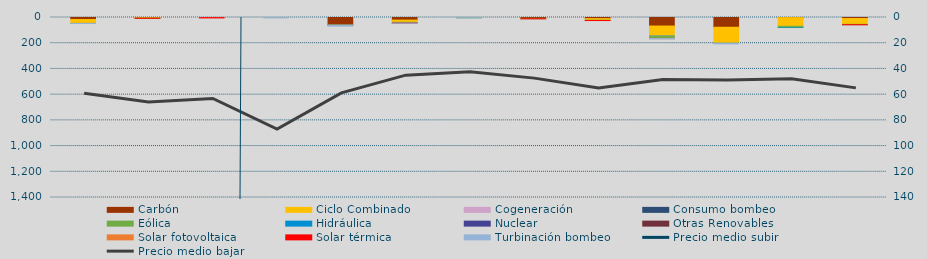
| Category | Carbón | Ciclo Combinado | Cogeneración | Consumo bombeo | Eólica | Hidráulica | Nuclear | Otras Renovables | Solar fotovoltaica | Solar térmica | Turbinación bombeo |
|---|---|---|---|---|---|---|---|---|---|---|---|
| 0 | 15307.2 | 30295.6 | 0 |  | 607.6 | 24 |  | 0 | 0 | 0 | 856 |
| 1 | 2438 | 3386 | 0 |  | 274 | 0 |  | 0 | 0 | 117.8 | 0 |
| 2 | 0 | 0 | 0 |  | 0 | 1009.1 |  | 0 | 0 | 2368.1 | 0 |
| 3 | 0 | 400 | 0 |  | 0 | 0 |  | 0 | 0 | 0 | 2763.2 |
| 4 | 58033.7 | 0 | 0 |  | 988.1 | 1026.5 |  | 0 | 57.8 | 0 | 6933.6 |
| 5 | 20255.7 | 17094 | 0 |  | 5344.3 | 623 |  | 0 | 0 | 617.6 | 755.1 |
| 6 | 158.4 | 0 | 0 |  | 1844.3 | 12 |  | 0 | 0 | 0 | 1460 |
| 7 | 6575 | 0 | 0 |  | 2859 | 0 |  | 0 | 0 | 725.3 | 0 |
| 8 | 8771 | 12552 | 0 |  | 1652.9 | 70 |  | 0 | 0 | 608.7 | 0 |
| 9 | 66423 | 75034.9 | 910.1 |  | 19943.3 | 36 |  | 0 | 1820.4 | 0 | 2822.9 |
| 10 | 75870.4 | 123130.8 | 0 |  | 1278.3 | 0 |  | 288.4 | 0 | 0 | 5090.1 |
| 11 | 802.5 | 67762.6 | 0 |  | 9561.7 | 4762.5 |  | 0 | 0 | 0 | 0 |
| 12 | 7913 | 45184 | 0 |  | 2732.2 | 54.3 |  | 0 | 0 | 784 | 0 |